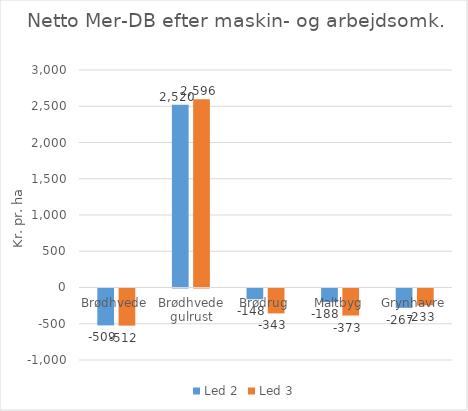
| Category | Led 2 | Led 3 |
|---|---|---|
| Brødhvede | -508.7 | -511.95 |
| Brødhvede gulrust | 2519.8 | 2596.05 |
| Brødrug | -148.462 | -343.385 |
| Maltbyg | -187.84 | -373.06 |
| Grynhavre | -267.2 | -233.25 |